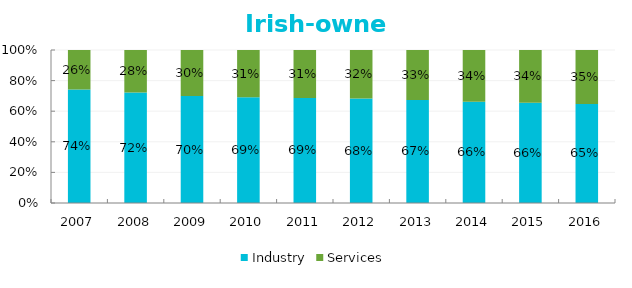
| Category | Industry | Services |
|---|---|---|
| 2007.0 | 0.742 | 0.258 |
| 2008.0 | 0.722 | 0.278 |
| 2009.0 | 0.699 | 0.301 |
| 2010.0 | 0.691 | 0.309 |
| 2011.0 | 0.687 | 0.313 |
| 2012.0 | 0.684 | 0.316 |
| 2013.0 | 0.674 | 0.326 |
| 2014.0 | 0.661 | 0.339 |
| 2015.0 | 0.655 | 0.345 |
| 2016.0 | 0.648 | 0.352 |